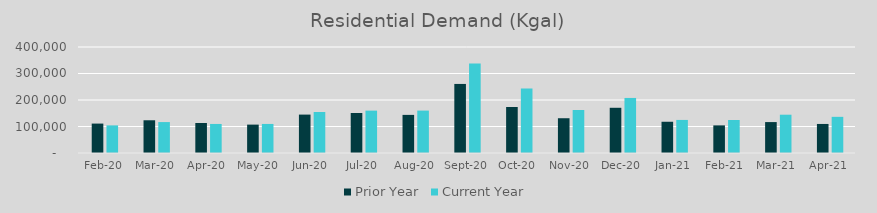
| Category | Prior Year | Current Year |
|---|---|---|
| 2020-02-01 | 111009.962 | 104204.224 |
| 2020-03-01 | 123525.131 | 116687.491 |
| 2020-04-01 | 113258.787 | 109598.965 |
| 2020-05-01 | 107128.051 | 109656.015 |
| 2020-06-01 | 144930.453 | 154696.236 |
| 2020-07-01 | 151028.014 | 159889.353 |
| 2020-08-01 | 143816.337 | 160013.985 |
| 2020-09-01 | 260607.456 | 337995.641 |
| 2020-10-01 | 173601.368 | 243049.084 |
| 2020-11-01 | 131198.833 | 162175.563 |
| 2020-12-01 | 170629.384 | 207737.904 |
| 2021-01-01 | 117899.625 | 124779.797 |
| 2021-02-01 | 104204.224 | 124538.238 |
| 2021-03-01 | 116687.491 | 144510.137 |
| 2021-04-01 | 109598.965 | 136465.793 |